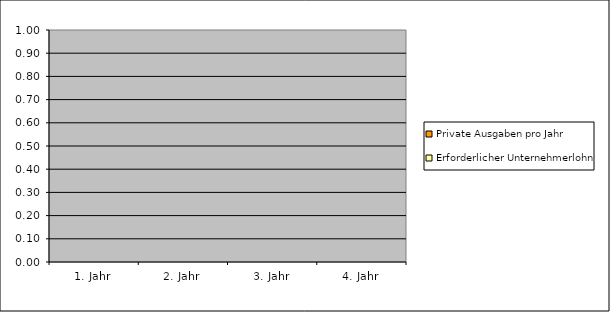
| Category | Private Ausgaben pro Jahr | Erforderlicher Unternehmerlohn |
|---|---|---|
| 1. Jahr | 0 | 0 |
| 2. Jahr | 0 | 0 |
| 3. Jahr | 0 | 0 |
| 4. Jahr | 0 | 0 |